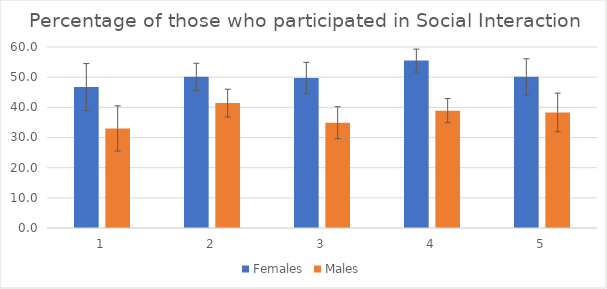
| Category | Females | Males |
|---|---|---|
| 0 | 46.7 | 33 |
| 1 | 50.1 | 41.4 |
| 2 | 49.7 | 34.9 |
| 3 | 55.5 | 38.9 |
| 4 | 50.1 | 38.3 |